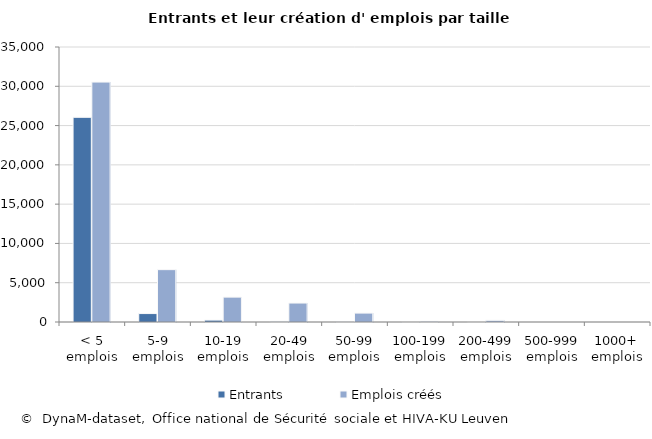
| Category | Entrants | Emplois créés |
|---|---|---|
| < 5 emplois | 26050 | 30537 |
| 5-9 emplois | 1072 | 6663 |
| 10-19 emplois | 243 | 3167 |
| 20-49 emplois | 85 | 2414 |
| 50-99 emplois | 18 | 1134 |
| 100-199 emplois | 1 | 103 |
| 200-499 emplois | 1 | 218 |
| 500-999 emplois | 0 | 0 |
| 1000+ emplois | 0 | 0 |